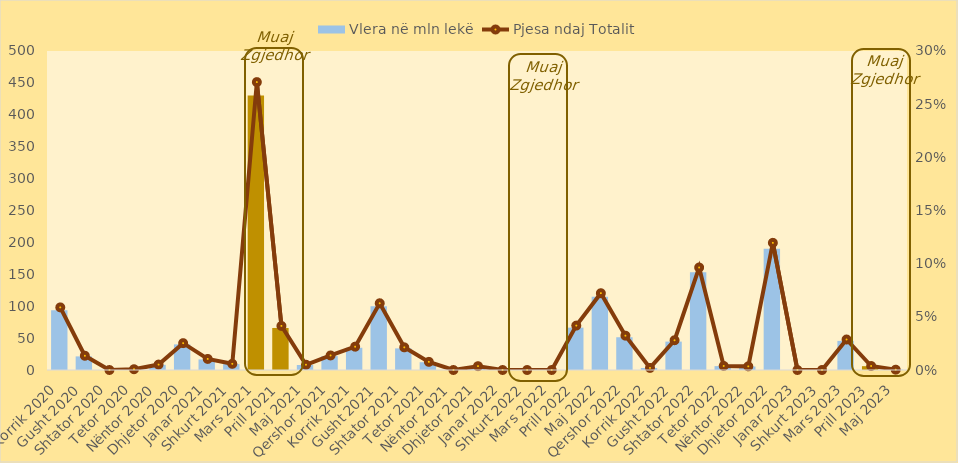
| Category | Vlera në mln lekë |
|---|---|
| Korrik 2020 | 93.6 |
| Gusht 2020 | 21.33 |
| Shtator 2020 | 0 |
| Tetor 2020 | 1.17 |
| Nëntor 2020 | 8.12 |
| Dhjetor 2020 | 40.16 |
| Janar 2021 | 16.57 |
| Shkurt 2021 | 9.22 |
| Mars 2021 | 430.407 |
| Prill 2021 | 65.889 |
| Maj 2021 | 7.85 |
| Qershor 2021 | 21.75 |
| Korrik 2021 | 34.868 |
| Gusht 2021 | 99.769 |
| Shtator 2021 | 33.865 |
| Tetor 2021 | 12.186 |
| Nëntor 2021 | 0 |
| Dhjetor 2021 | 5.732 |
| Janar 2022 | 0 |
| Shkurt 2022 | 0 |
| Mars 2022 | 0 |
| Prill 2022 | 66.38 |
| Maj 2022 | 114.807 |
| Qershor 2022 | 51.348 |
| Korrik 2022 | 3.104 |
| Gusht 2022 | 44.497 |
| Shtator 2022 | 153.232 |
| Tetor 2022 | 6.083 |
| Nëntor 2022 | 5.457 |
| Dhjetor 2022 | 190.107 |
| Janar 2023 | 0 |
| Shkurt 2023 | 0 |
| Mars 2023 | 45.603 |
| Prill 2023 | 5.991 |
| Maj 2023 | 0.48 |